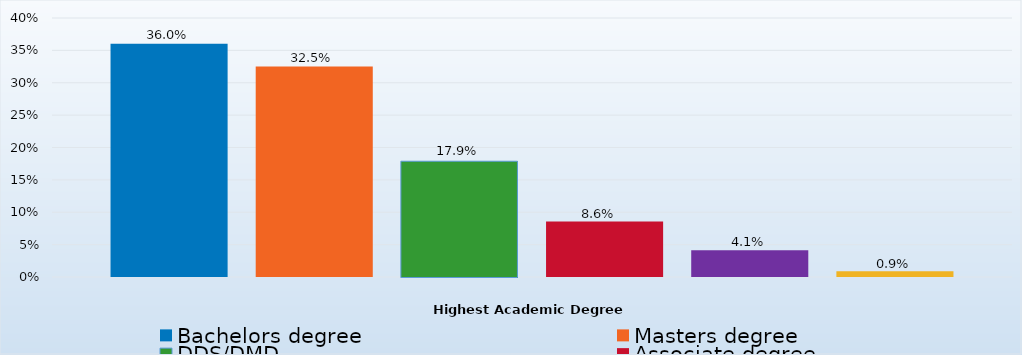
| Category | Bachelors degree | Masters degree | DDS/DMD | Associate degree | Doctorate degree | Certificate/Diploma/Other |
|---|---|---|---|---|---|---|
| Percent | 0.36 | 0.325 | 0.179 | 0.086 | 0.041 | 0.009 |